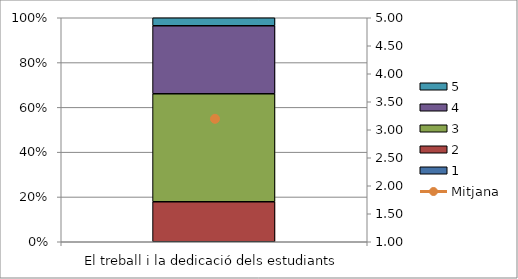
| Category | 1 | 2 | 3 | 4 | 5 |
|---|---|---|---|---|---|
| El treball i la dedicació dels estudiants | 0 | 10 | 27 | 17 | 2 |